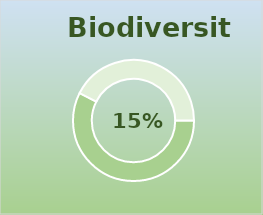
| Category | Series 0 |
|---|---|
| 0 | 1.15 |
| 1 | 0.85 |